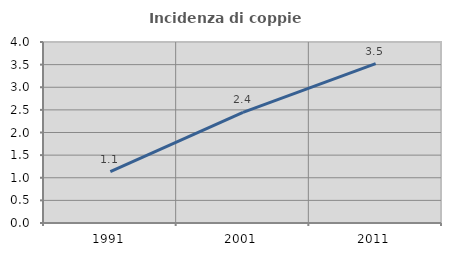
| Category | Incidenza di coppie miste |
|---|---|
| 1991.0 | 1.136 |
| 2001.0 | 2.445 |
| 2011.0 | 3.52 |